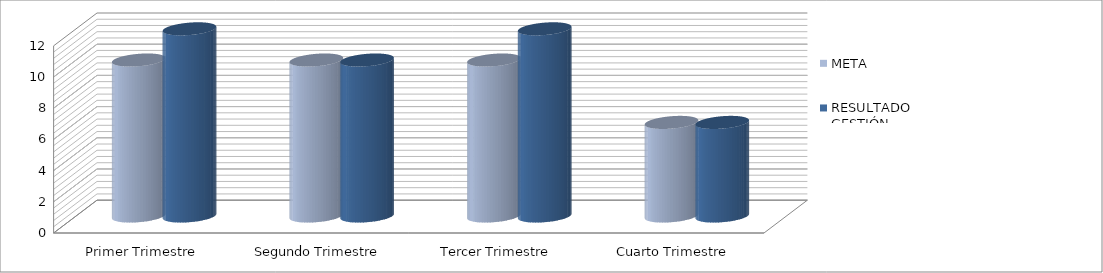
| Category | META | RESULTADO  GESTIÓN PERÍODO |
|---|---|---|
| Primer Trimestre | 10 | 12 |
| Segundo Trimestre | 10 | 10 |
| Tercer Trimestre | 10 | 12 |
| Cuarto Trimestre | 6 | 6 |